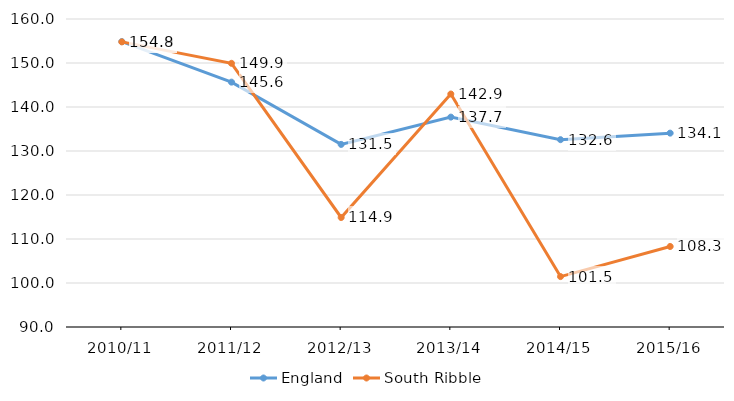
| Category | England | South Ribble |
|---|---|---|
| 2010/11 | 154.858 | 154.799 |
| 2011/12 | 145.649 | 149.926 |
| 2012/13 | 131.501 | 114.888 |
| 2013/14 | 137.702 | 142.95 |
| 2014/15 | 132.576 | 101.46 |
| 2015/16 | 134.061 | 108.3 |